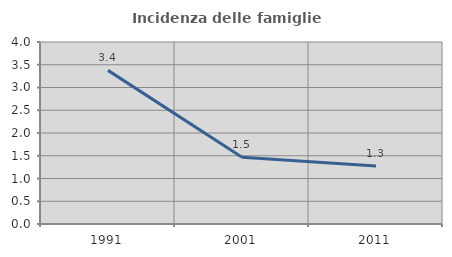
| Category | Incidenza delle famiglie numerose |
|---|---|
| 1991.0 | 3.376 |
| 2001.0 | 1.468 |
| 2011.0 | 1.276 |